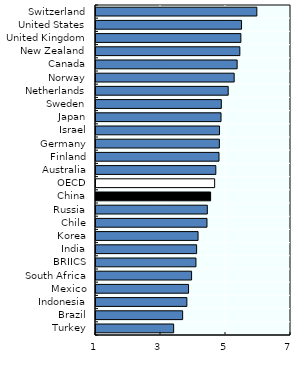
| Category | 2016-17 |
|---|---|
| Turkey | 3.389 |
| Brazil | 3.666 |
| Indonesia | 3.796 |
| Mexico | 3.848 |
| South Africa | 3.941 |
| BRIICS | 4.075 |
| India | 4.096 |
| Korea | 4.14 |
| Chile | 4.415 |
| Russia | 4.425 |
| China | 4.527 |
| OECD | 4.651 |
| Australia | 4.687 |
| Finland | 4.785 |
| Germany | 4.796 |
| Israel | 4.801 |
| Japan | 4.847 |
| Sweden | 4.856 |
| Netherlands | 5.068 |
| Norway | 5.252 |
| Canada | 5.342 |
| New Zealand | 5.426 |
| United Kingdom | 5.458 |
| United States | 5.478 |
| Switzerland | 5.949 |